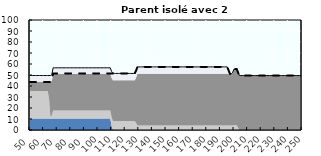
| Category | Coin fiscal marginal (somme des composantes) | Taux d’imposition marginal net |
|---|---|---|
| 50.0 | 49.541 | 43.61 |
| 51.0 | 49.541 | 43.61 |
| 52.0 | 49.541 | 43.61 |
| 53.0 | 49.541 | 43.61 |
| 54.0 | 49.541 | 43.61 |
| 55.0 | 49.541 | 43.61 |
| 56.0 | 49.541 | 43.61 |
| 57.0 | 49.541 | 43.61 |
| 58.0 | 49.541 | 43.61 |
| 59.0 | 49.541 | 43.61 |
| 60.0 | 49.541 | 43.61 |
| 61.0 | 49.541 | 43.61 |
| 62.0 | 49.541 | 43.61 |
| 63.0 | 49.541 | 43.61 |
| 64.0 | 49.541 | 43.61 |
| 65.0 | 49.541 | 43.61 |
| 66.0 | 50.052 | 44.181 |
| 67.0 | 56.541 | 51.433 |
| 68.0 | 56.541 | 51.433 |
| 69.0 | 56.541 | 51.433 |
| 70.0 | 56.541 | 51.433 |
| 71.0 | 56.541 | 51.433 |
| 72.0 | 56.541 | 51.433 |
| 73.0 | 56.541 | 51.433 |
| 74.0 | 56.541 | 51.433 |
| 75.0 | 56.541 | 51.433 |
| 76.0 | 56.541 | 51.433 |
| 77.0 | 56.541 | 51.433 |
| 78.0 | 56.541 | 51.433 |
| 79.0 | 56.541 | 51.433 |
| 80.0 | 56.541 | 51.433 |
| 81.0 | 56.541 | 51.433 |
| 82.0 | 56.541 | 51.433 |
| 83.0 | 56.541 | 51.433 |
| 84.0 | 56.541 | 51.433 |
| 85.0 | 56.541 | 51.433 |
| 86.0 | 56.541 | 51.433 |
| 87.0 | 56.541 | 51.433 |
| 88.0 | 56.541 | 51.433 |
| 89.0 | 56.541 | 51.433 |
| 90.0 | 56.541 | 51.433 |
| 91.0 | 56.541 | 51.433 |
| 92.0 | 56.541 | 51.433 |
| 93.0 | 56.541 | 51.433 |
| 94.0 | 56.541 | 51.433 |
| 95.0 | 56.541 | 51.433 |
| 96.0 | 56.541 | 51.433 |
| 97.0 | 56.541 | 51.433 |
| 98.0 | 56.541 | 51.433 |
| 99.0 | 56.541 | 51.433 |
| 100.0 | 56.541 | 51.433 |
| 101.0 | 56.541 | 51.433 |
| 102.0 | 56.541 | 51.433 |
| 103.0 | 56.541 | 51.433 |
| 104.0 | 56.541 | 51.433 |
| 105.0 | 56.541 | 51.433 |
| 106.0 | 56.541 | 51.433 |
| 107.0 | 56.541 | 51.433 |
| 108.0 | 56.541 | 51.433 |
| 109.0 | 56.541 | 51.433 |
| 110.0 | 53.264 | 51.433 |
| 111.0 | 51.433 | 51.433 |
| 112.0 | 51.433 | 51.433 |
| 113.0 | 51.433 | 51.433 |
| 114.0 | 51.433 | 51.433 |
| 115.0 | 51.433 | 51.433 |
| 116.0 | 51.433 | 51.433 |
| 117.0 | 51.433 | 51.433 |
| 118.0 | 51.433 | 51.433 |
| 119.0 | 51.433 | 51.433 |
| 120.0 | 51.433 | 51.433 |
| 121.0 | 51.433 | 51.433 |
| 122.0 | 51.433 | 51.433 |
| 123.0 | 51.433 | 51.433 |
| 124.0 | 51.433 | 51.433 |
| 125.0 | 51.433 | 51.433 |
| 126.0 | 51.433 | 51.433 |
| 127.0 | 51.433 | 51.433 |
| 128.0 | 53.928 | 53.928 |
| 129.0 | 57.365 | 57.365 |
| 130.0 | 57.365 | 57.365 |
| 131.0 | 57.365 | 57.365 |
| 132.0 | 57.365 | 57.365 |
| 133.0 | 57.365 | 57.365 |
| 134.0 | 57.365 | 57.365 |
| 135.0 | 57.365 | 57.365 |
| 136.0 | 57.365 | 57.365 |
| 137.0 | 57.365 | 57.365 |
| 138.0 | 57.365 | 57.365 |
| 139.0 | 57.365 | 57.365 |
| 140.0 | 57.365 | 57.365 |
| 141.0 | 57.365 | 57.365 |
| 142.0 | 57.365 | 57.365 |
| 143.0 | 57.365 | 57.365 |
| 144.0 | 57.365 | 57.365 |
| 145.0 | 57.365 | 57.365 |
| 146.0 | 57.365 | 57.365 |
| 147.0 | 57.365 | 57.365 |
| 148.0 | 57.365 | 57.365 |
| 149.0 | 57.365 | 57.365 |
| 150.0 | 57.365 | 57.365 |
| 151.0 | 57.365 | 57.365 |
| 152.0 | 57.365 | 57.365 |
| 153.0 | 57.365 | 57.365 |
| 154.0 | 57.365 | 57.365 |
| 155.0 | 57.365 | 57.365 |
| 156.0 | 57.365 | 57.365 |
| 157.0 | 57.365 | 57.365 |
| 158.0 | 57.365 | 57.365 |
| 159.0 | 57.365 | 57.365 |
| 160.0 | 57.365 | 57.365 |
| 161.0 | 57.365 | 57.365 |
| 162.0 | 57.365 | 57.365 |
| 163.0 | 57.365 | 57.365 |
| 164.0 | 57.365 | 57.365 |
| 165.0 | 57.365 | 57.365 |
| 166.0 | 57.365 | 57.365 |
| 167.0 | 57.365 | 57.365 |
| 168.0 | 57.365 | 57.365 |
| 169.0 | 57.365 | 57.365 |
| 170.0 | 57.365 | 57.365 |
| 171.0 | 57.365 | 57.365 |
| 172.0 | 57.365 | 57.365 |
| 173.0 | 57.365 | 57.365 |
| 174.0 | 57.365 | 57.365 |
| 175.0 | 57.365 | 57.365 |
| 176.0 | 57.365 | 57.365 |
| 177.0 | 57.365 | 57.365 |
| 178.0 | 57.365 | 57.365 |
| 179.0 | 57.365 | 57.365 |
| 180.0 | 57.365 | 57.365 |
| 181.0 | 57.365 | 57.365 |
| 182.0 | 57.365 | 57.365 |
| 183.0 | 57.365 | 57.365 |
| 184.0 | 57.365 | 57.365 |
| 185.0 | 57.365 | 57.365 |
| 186.0 | 57.365 | 57.365 |
| 187.0 | 57.365 | 57.365 |
| 188.0 | 57.365 | 57.365 |
| 189.0 | 57.365 | 57.365 |
| 190.0 | 57.365 | 57.365 |
| 191.0 | 57.365 | 57.365 |
| 192.0 | 57.365 | 57.365 |
| 193.0 | 57.365 | 57.365 |
| 194.0 | 57.365 | 57.365 |
| 195.0 | 57.365 | 57.365 |
| 196.0 | 54.309 | 54.309 |
| 197.0 | 51.13 | 51.13 |
| 198.0 | 51.13 | 51.13 |
| 199.0 | 52.305 | 52.305 |
| 200.0 | 55.36 | 55.36 |
| 201.0 | 55.36 | 55.36 |
| 202.0 | 55.36 | 55.36 |
| 203.0 | 52.269 | 52.269 |
| 204.0 | 49.5 | 49.5 |
| 205.0 | 49.5 | 49.5 |
| 206.0 | 49.5 | 49.5 |
| 207.0 | 49.5 | 49.5 |
| 208.0 | 49.5 | 49.5 |
| 209.0 | 49.5 | 49.5 |
| 210.0 | 49.5 | 49.5 |
| 211.0 | 49.5 | 49.5 |
| 212.0 | 49.5 | 49.5 |
| 213.0 | 49.5 | 49.5 |
| 214.0 | 49.5 | 49.5 |
| 215.0 | 49.5 | 49.5 |
| 216.0 | 49.5 | 49.5 |
| 217.0 | 49.5 | 49.5 |
| 218.0 | 49.5 | 49.5 |
| 219.0 | 49.5 | 49.5 |
| 220.0 | 49.5 | 49.5 |
| 221.0 | 49.5 | 49.5 |
| 222.0 | 49.5 | 49.5 |
| 223.0 | 49.5 | 49.5 |
| 224.0 | 49.5 | 49.5 |
| 225.0 | 49.5 | 49.5 |
| 226.0 | 49.5 | 49.5 |
| 227.0 | 49.5 | 49.5 |
| 228.0 | 49.5 | 49.5 |
| 229.0 | 49.5 | 49.5 |
| 230.0 | 49.5 | 49.5 |
| 231.0 | 49.5 | 49.5 |
| 232.0 | 49.5 | 49.5 |
| 233.0 | 49.5 | 49.5 |
| 234.0 | 49.5 | 49.5 |
| 235.0 | 49.5 | 49.5 |
| 236.0 | 49.5 | 49.5 |
| 237.0 | 49.5 | 49.5 |
| 238.0 | 49.5 | 49.5 |
| 239.0 | 49.5 | 49.5 |
| 240.0 | 49.5 | 49.5 |
| 241.0 | 49.5 | 49.5 |
| 242.0 | 49.5 | 49.5 |
| 243.0 | 49.5 | 49.5 |
| 244.0 | 49.5 | 49.5 |
| 245.0 | 49.5 | 49.5 |
| 246.0 | 49.5 | 49.5 |
| 247.0 | 49.5 | 49.5 |
| 248.0 | 49.5 | 49.5 |
| 249.0 | 49.5 | 49.5 |
| 250.0 | 49.5 | 49.5 |